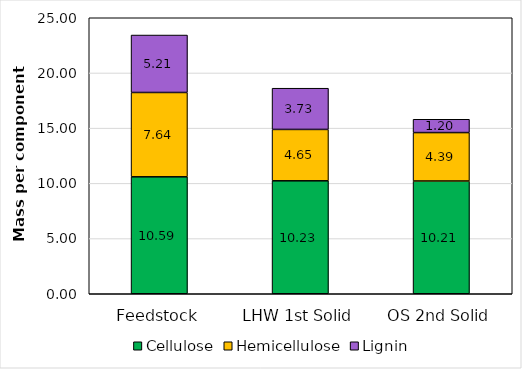
| Category | Cellulose | Hemicellulose | Lignin |
|---|---|---|---|
| Feedstock | 10.593 | 7.638 | 5.205 |
| LHW 1st Solid | 10.231 | 4.654 | 3.734 |
| OS 2nd Solid | 10.213 | 4.387 | 1.205 |